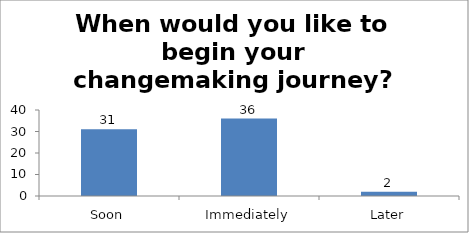
| Category | When would you like to begin your changemaking journey?  |
|---|---|
| Soon | 31 |
| Immediately | 36 |
| Later | 2 |